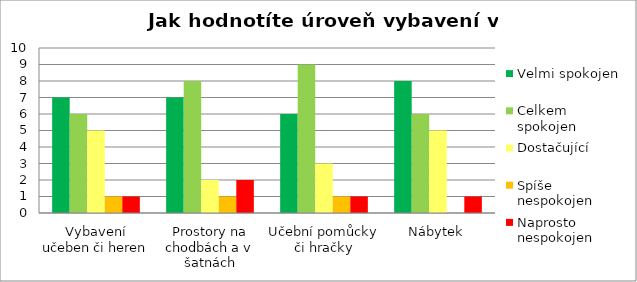
| Category | Velmi spokojen | Celkem 
spokojen | Dostačující | Spíše 
nespokojen | Naprosto 
nespokojen |
|---|---|---|---|---|---|
| Vybavení učeben či heren | 7 | 6 | 5 | 1 | 1 |
| Prostory na chodbách a v šatnách | 7 | 8 | 2 | 1 | 2 |
| Učební pomůcky či hračky | 6 | 9 | 3 | 1 | 1 |
| Nábytek | 8 | 6 | 5 | 0 | 1 |